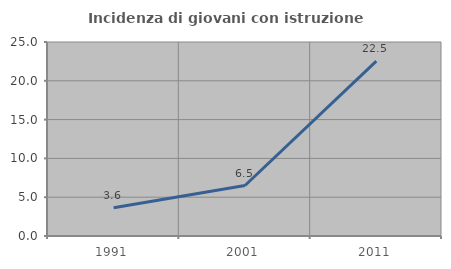
| Category | Incidenza di giovani con istruzione universitaria |
|---|---|
| 1991.0 | 3.629 |
| 2001.0 | 6.504 |
| 2011.0 | 22.535 |